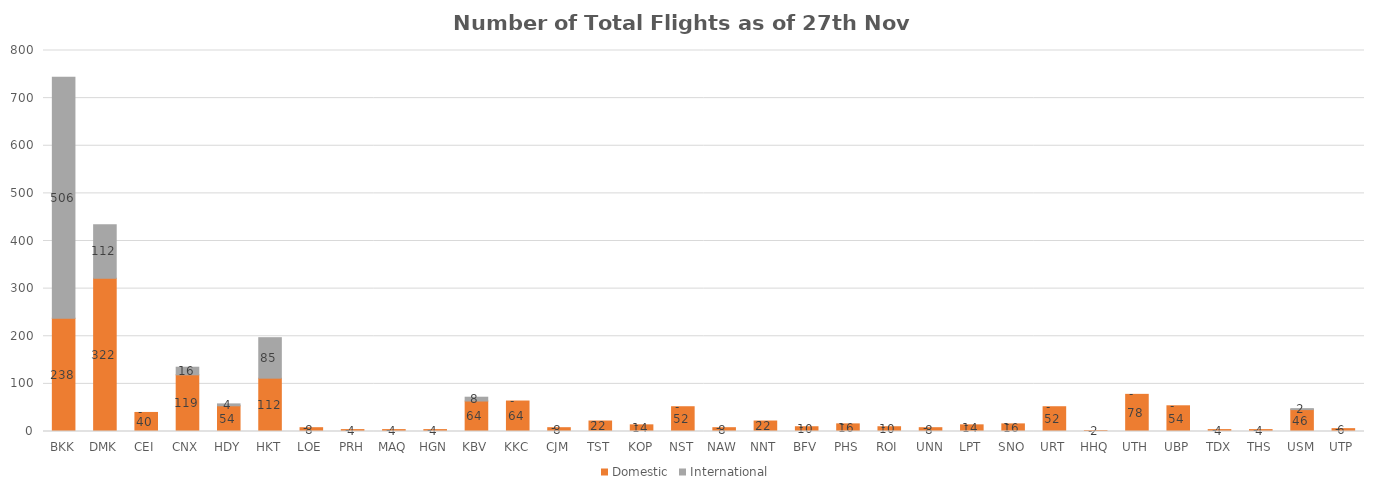
| Category | Domestic | International |
|---|---|---|
| BKK | 238 | 506 |
| DMK | 322 | 112 |
| CEI | 40 | 0 |
| CNX | 119 | 16 |
| HDY | 54 | 4 |
| HKT | 112 | 85 |
| LOE | 8 | 0 |
| PRH | 4 | 0 |
| MAQ | 4 | 0 |
| HGN | 4 | 0 |
| KBV | 64 | 8 |
| KKC | 64 | 0 |
| CJM | 8 | 0 |
| TST | 22 | 0 |
| KOP | 14 | 0 |
| NST | 52 | 0 |
| NAW | 8 | 0 |
| NNT | 22 | 0 |
| BFV | 10 | 0 |
| PHS | 16 | 0 |
| ROI | 10 | 0 |
| UNN | 8 | 0 |
| LPT | 14 | 0 |
| SNO | 16 | 0 |
| URT | 52 | 0 |
| HHQ | 2 | 0 |
| UTH | 78 | 0 |
| UBP | 54 | 0 |
| TDX | 4 | 0 |
| THS | 4 | 0 |
| USM | 46 | 2 |
| UTP | 6 | 0 |